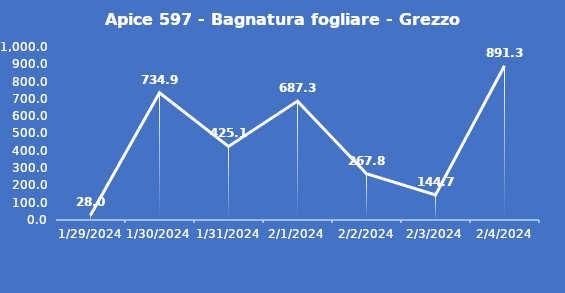
| Category | Apice 597 - Bagnatura fogliare - Grezzo (min) |
|---|---|
| 1/29/24 | 28 |
| 1/30/24 | 734.9 |
| 1/31/24 | 425.1 |
| 2/1/24 | 687.3 |
| 2/2/24 | 267.8 |
| 2/3/24 | 144.7 |
| 2/4/24 | 891.3 |